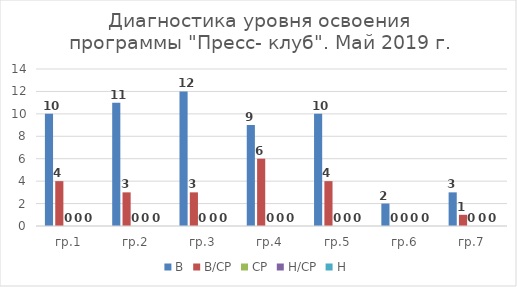
| Category | В | В/СР | СР | Н/СР | Н |
|---|---|---|---|---|---|
| гр.1 | 10 | 4 | 0 | 0 | 0 |
| гр.2 | 11 | 3 | 0 | 0 | 0 |
| гр.3 | 12 | 3 | 0 | 0 | 0 |
| гр.4 | 9 | 6 | 0 | 0 | 0 |
| гр.5 | 10 | 4 | 0 | 0 | 0 |
| гр.6 | 2 | 0 | 0 | 0 | 0 |
| гр.7 | 3 | 1 | 0 | 0 | 0 |